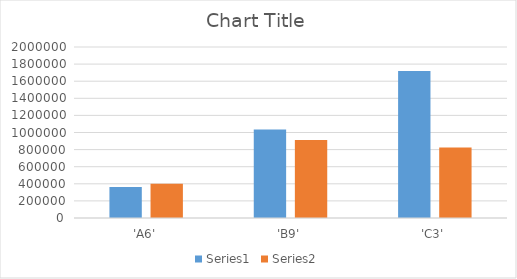
| Category | Series 0 | Series 1 |
|---|---|---|
| 'A6' | 363661.5 | 400092.786 |
| 'B9' | 1034639.875 | 911020.562 |
| 'C3' | 1719043.667 | 824987.556 |